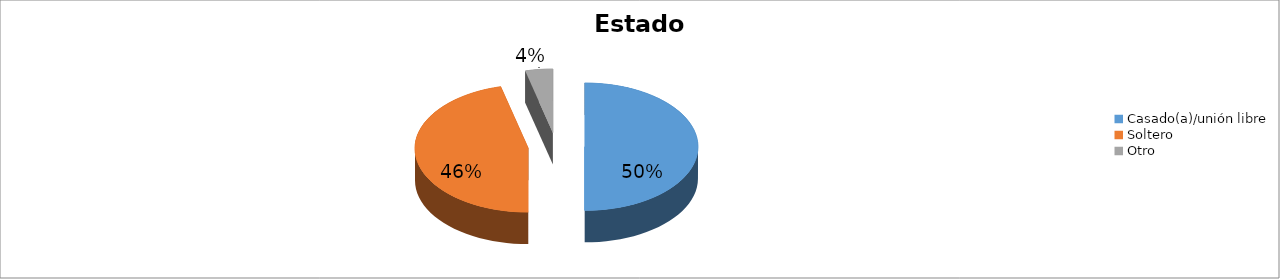
| Category | Series 0 |
|---|---|
| Casado(a)/unión libre | 0.5 |
| Soltero | 0.461 |
| Otro | 0.039 |